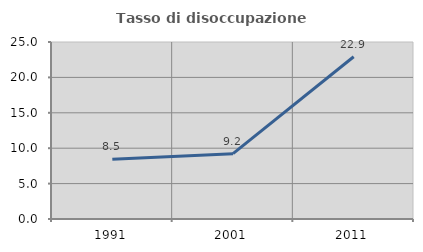
| Category | Tasso di disoccupazione giovanile  |
|---|---|
| 1991.0 | 8.451 |
| 2001.0 | 9.231 |
| 2011.0 | 22.917 |